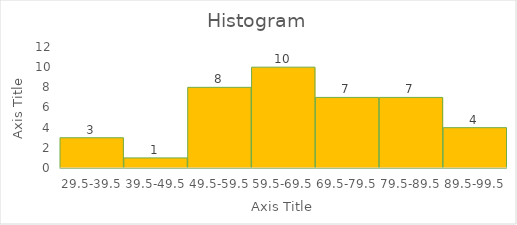
| Category | Frequency |
|---|---|
| 29.5-39.5 | 3 |
| 39.5-49.5 | 1 |
| 49.5-59.5 | 8 |
| 59.5-69.5 | 10 |
| 69.5-79.5 | 7 |
| 79.5-89.5 | 7 |
| 89.5-99.5 | 4 |